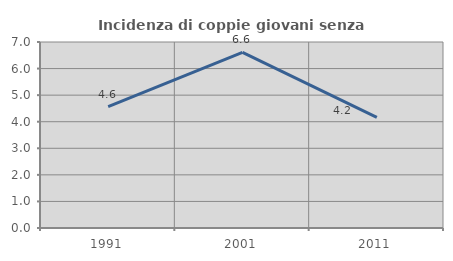
| Category | Incidenza di coppie giovani senza figli |
|---|---|
| 1991.0 | 4.569 |
| 2001.0 | 6.608 |
| 2011.0 | 4.167 |